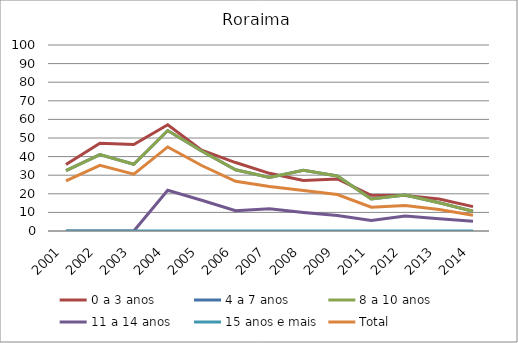
| Category | 0 a 3 anos | 4 a 7 anos | 8 a 10 anos | 11 a 14 anos | 15 anos e mais | Total |
|---|---|---|---|---|---|---|
| 2001.0 | 35.8 | 32.5 | 32.5 | 0 | 0 | 27 |
| 2002.0 | 47.2 | 41.1 | 41.1 | 0 | 0 | 35.3 |
| 2003.0 | 46.5 | 35.9 | 35.9 | 0 | 0 | 30.6 |
| 2004.0 | 57.1 | 54 | 54 | 21.9 | 0 | 45.2 |
| 2005.0 | 43.4 | 43 | 43 | 16.5 | 0 | 35.2 |
| 2006.0 | 36.8 | 32.9 | 32.9 | 10.9 | 0 | 26.7 |
| 2007.0 | 31 | 28.8 | 28.8 | 12 | 0 | 23.9 |
| 2008.0 | 27.2 | 32.7 | 32.7 | 10 | 0 | 21.8 |
| 2009.0 | 28 | 29.6 | 29.6 | 8.3 | 0 | 19.6 |
| 2011.0 | 19.2 | 17.2 | 17.2 | 5.7 | 0 | 12.8 |
| 2012.0 | 19.1 | 19.3 | 19.3 | 8 | 0 | 13.7 |
| 2013.0 | 17.2 | 15.2 | 15.2 | 6.6 | 0 | 11.5 |
| 2014.0 | 13.1 | 10.6 | 10.6 | 5.3 | 0 | 8.5 |